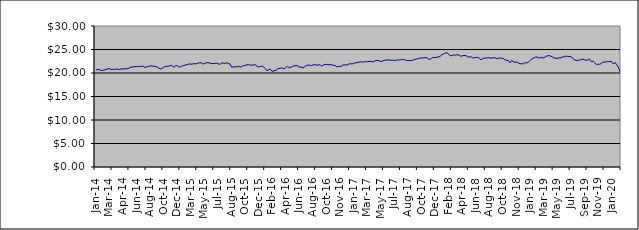
| Category | Series 0 |
|---|---|
| 2014-01-09 | 20.666 |
| 2014-01-17 | 20.724 |
| 2014-01-23 | 20.754 |
| 2014-01-31 | 20.538 |
| 2014-02-10 | 20.55 |
| 2014-02-14 | 20.67 |
| 2014-02-20 | 20.75 |
| 2014-02-28 | 20.867 |
| 2014-03-10 | 20.933 |
| 2014-03-14 | 20.735 |
| 2014-03-20 | 20.783 |
| 2014-03-26 | 20.75 |
| 2014-03-31 | 20.834 |
| 2014-04-09 | 20.834 |
| 2014-04-15 | 20.704 |
| 2014-04-24 | 20.882 |
| 2014-04-30 | 20.864 |
| 2014-05-08 | 20.894 |
| 2014-05-16 | 20.901 |
| 2014-05-22 | 20.916 |
| 2014-05-31 | 21.158 |
| 2014-06-09 | 21.254 |
| 2014-06-16 | 21.292 |
| 2014-06-20 | 21.373 |
| 2014-06-30 | 21.349 |
| 2014-07-09 | 21.404 |
| 2014-07-15 | 21.408 |
| 2014-07-22 | 21.373 |
| 2014-07-31 | 21.481 |
| 2014-08-11 | 21.163 |
| 2014-08-14 | 21.275 |
| 2014-08-21 | 21.422 |
| 2014-08-30 | 21.49 |
| 2014-09-08 | 21.526 |
| 2014-09-16 | 21.416 |
| 2014-09-23 | 21.419 |
| 2014-09-30 | 21.284 |
| 2014-10-09 | 21.092 |
| 2014-10-16 | 20.83 |
| 2014-10-23 | 20.989 |
| 2014-10-31 | 21.237 |
| 2014-11-10 | 21.374 |
| 2014-11-13 | 21.414 |
| 2014-11-20 | 21.463 |
| 2014-11-29 | 21.615 |
| 2014-12-10 | 21.551 |
| 2014-12-18 | 21.2 |
| 2014-12-23 | 21.522 |
| 2014-12-30 | 21.583 |
| 2015-01-08 | 21.22 |
| 2015-01-15 | 21.341 |
| 2015-01-30 | 21.559 |
| 2015-02-10 | 21.572 |
| 2015-02-16 | 21.742 |
| 2015-02-19 | 21.803 |
| 2015-02-28 | 21.937 |
| 2015-03-10 | 21.878 |
| 2015-03-13 | 21.911 |
| 2015-03-19 | 21.994 |
| 2015-03-27 | 21.938 |
| 2015-04-07 | 22.02 |
| 2015-04-16 | 22.192 |
| 2015-04-27 | 22.188 |
| 2015-05-08 | 21.935 |
| 2015-05-14 | 21.998 |
| 2015-05-21 | 22.2 |
| 2015-05-27 | 22.171 |
| 2015-06-03 | 22.151 |
| 2015-06-09 | 21.994 |
| 2015-06-15 | 22.021 |
| 2015-06-22 | 22.006 |
| 2015-06-26 | 22.121 |
| 2015-07-02 | 21.962 |
| 2015-07-09 | 21.831 |
| 2015-07-14 | 22.063 |
| 2015-07-23 | 22.162 |
| 2015-07-29 | 22 |
| 2015-08-06 | 22.186 |
| 2015-08-13 | 22.006 |
| 2015-08-20 | 21.939 |
| 2015-08-27 | 21.245 |
| 2015-09-03 | 21.294 |
| 2015-09-09 | 21.304 |
| 2015-09-15 | 21.325 |
| 2015-09-21 | 21.47 |
| 2015-09-28 | 21.222 |
| 2015-10-07 | 21.404 |
| 2015-10-13 | 21.558 |
| 2015-10-22 | 21.599 |
| 2015-10-28 | 21.742 |
| 2015-11-04 | 21.799 |
| 2015-11-13 | 21.658 |
| 2015-11-19 | 21.665 |
| 2015-11-27 | 21.73 |
| 2015-12-03 | 21.75 |
| 2015-12-10 | 21.462 |
| 2015-12-15 | 21.249 |
| 2015-12-23 | 21.385 |
| 2015-12-29 | 21.477 |
| 2016-01-07 | 21.222 |
| 2016-01-14 | 20.912 |
| 2016-01-21 | 20.454 |
| 2016-01-28 | 20.804 |
| 2016-02-04 | 20.723 |
| 2016-02-11 | 20.312 |
| 2016-02-18 | 20.531 |
| 2016-02-25 | 20.482 |
| 2016-03-03 | 20.907 |
| 2016-03-10 | 20.922 |
| 2016-03-16 | 21.067 |
| 2016-03-29 | 21.016 |
| 2016-04-07 | 20.886 |
| 2016-04-14 | 21.175 |
| 2016-04-28 | 21.406 |
| 2016-05-05 | 21.108 |
| 2016-05-12 | 21.218 |
| 2016-05-19 | 21.383 |
| 2016-05-30 | 21.562 |
| 2016-06-03 | 21.52 |
| 2016-06-09 | 21.596 |
| 2016-06-15 | 21.178 |
| 2016-06-23 | 21.328 |
| 2016-06-29 | 21.059 |
| 2016-07-11 | 21.326 |
| 2016-07-14 | 21.563 |
| 2016-07-21 | 21.675 |
| 2016-07-28 | 21.663 |
| 2016-08-04 | 21.548 |
| 2016-08-11 | 21.725 |
| 2016-08-16 | 21.758 |
| 2016-08-24 | 21.706 |
| 2016-08-30 | 21.669 |
| 2016-09-08 | 21.8 |
| 2016-09-15 | 21.439 |
| 2016-09-22 | 21.686 |
| 2016-09-29 | 21.832 |
| 2016-10-06 | 21.816 |
| 2016-10-13 | 21.734 |
| 2016-10-20 | 21.819 |
| 2016-10-28 | 21.738 |
| 2016-11-03 | 21.632 |
| 2016-11-10 | 21.582 |
| 2016-11-15 | 21.315 |
| 2016-11-23 | 21.396 |
| 2016-11-29 | 21.374 |
| 2016-12-07 | 21.539 |
| 2016-12-14 | 21.763 |
| 2016-12-21 | 21.71 |
| 2016-12-28 | 21.701 |
| 2017-01-05 | 21.895 |
| 2017-01-16 | 21.981 |
| 2017-01-23 | 21.918 |
| 2017-01-30 | 22.061 |
| 2017-02-06 | 22.14 |
| 2017-02-13 | 22.243 |
| 2017-02-20 | 22.313 |
| 2017-02-27 | 22.378 |
| 2017-03-06 | 22.357 |
| 2017-03-13 | 22.281 |
| 2017-03-20 | 22.463 |
| 2017-03-27 | 22.367 |
| 2017-03-30 | 22.472 |
| 2017-04-10 | 22.469 |
| 2017-04-18 | 22.375 |
| 2017-04-24 | 22.479 |
| 2017-04-28 | 22.666 |
| 2017-05-08 | 22.645 |
| 2017-05-15 | 22.624 |
| 2017-05-22 | 22.419 |
| 2017-05-30 | 22.563 |
| 2017-06-06 | 22.664 |
| 2017-06-12 | 22.746 |
| 2017-06-15 | 22.757 |
| 2017-06-20 | 22.756 |
| 2017-06-29 | 22.709 |
| 2017-07-04 | 22.742 |
| 2017-07-10 | 22.637 |
| 2017-07-14 | 22.734 |
| 2017-07-19 | 22.762 |
| 2017-07-24 | 22.795 |
| 2017-07-28 | 22.833 |
| 2017-08-03 | 22.858 |
| 2017-08-09 | 22.839 |
| 2017-08-14 | 22.661 |
| 2017-08-21 | 22.63 |
| 2017-08-24 | 22.655 |
| 2017-08-30 | 22.659 |
| 2017-09-07 | 22.724 |
| 2017-09-14 | 22.906 |
| 2017-09-20 | 22.994 |
| 2017-09-29 | 23.048 |
| 2017-10-05 | 23.176 |
| 2017-10-11 | 23.201 |
| 2017-10-16 | 23.212 |
| 2017-10-23 | 23.262 |
| 2017-10-30 | 23.251 |
| 2017-11-07 | 22.993 |
| 2017-11-15 | 22.86 |
| 2017-11-23 | 23.223 |
| 2017-11-29 | 23.282 |
| 2017-12-07 | 23.273 |
| 2017-12-13 | 23.357 |
| 2017-12-18 | 23.417 |
| 2017-12-28 | 23.583 |
| 2018-01-08 | 23.882 |
| 2018-01-17 | 24.082 |
| 2018-01-24 | 24.257 |
| 2018-01-30 | 24.271 |
| 2018-02-05 | 24.022 |
| 2018-02-13 | 23.612 |
| 2018-02-19 | 23.775 |
| 2018-02-27 | 23.86 |
| 2018-03-07 | 23.778 |
| 2018-03-14 | 23.922 |
| 2018-03-21 | 23.82 |
| 2018-03-29 | 23.571 |
| 2018-04-10 | 23.654 |
| 2018-04-16 | 23.737 |
| 2018-04-23 | 23.713 |
| 2018-04-27 | 23.478 |
| 2018-05-10 | 23.379 |
| 2018-05-15 | 23.476 |
| 2018-05-22 | 23.257 |
| 2018-05-30 | 23.217 |
| 2018-06-06 | 23.29 |
| 2018-06-13 | 23.342 |
| 2018-06-20 | 23.13 |
| 2018-06-29 | 22.795 |
| 2018-07-10 | 23.074 |
| 2018-07-16 | 23.195 |
| 2018-07-23 | 23.15 |
| 2018-07-30 | 23.252 |
| 2018-08-07 | 23.263 |
| 2018-08-13 | 23.134 |
| 2018-08-24 | 23.22 |
| 2018-08-30 | 23.285 |
| 2018-09-06 | 23.118 |
| 2018-09-13 | 23.004 |
| 2018-09-24 | 23.249 |
| 2018-09-28 | 23.124 |
| 2018-10-04 | 23.105 |
| 2018-10-10 | 22.844 |
| 2018-10-16 | 22.695 |
| 2018-10-23 | 22.685 |
| 2018-10-30 | 22.177 |
| 2018-11-07 | 22.641 |
| 2018-11-15 | 22.418 |
| 2018-11-21 | 22.291 |
| 2018-11-29 | 22.324 |
| 2018-12-07 | 22.174 |
| 2018-12-14 | 21.937 |
| 2018-12-21 | 21.995 |
| 2018-12-28 | 21.921 |
| 2019-01-08 | 22.216 |
| 2019-01-14 | 22.137 |
| 2019-01-21 | 22.343 |
| 2019-01-30 | 22.677 |
| 2019-02-11 | 22.991 |
| 2019-02-14 | 23.148 |
| 2019-02-21 | 23.363 |
| 2019-02-27 | 23.417 |
| 2019-03-07 | 23.219 |
| 2019-03-14 | 23.215 |
| 2019-03-21 | 23.355 |
| 2019-03-29 | 23.144 |
| 2019-04-04 | 23.52 |
| 2019-04-12 | 23.623 |
| 2019-04-18 | 23.722 |
| 2019-04-29 | 23.593 |
| 2019-05-08 | 23.456 |
| 2019-05-15 | 23.177 |
| 2019-05-23 | 23.173 |
| 2019-05-30 | 23.075 |
| 2019-06-10 | 23.23 |
| 2019-06-14 | 23.2 |
| 2019-06-21 | 23.421 |
| 2019-06-28 | 23.429 |
| 2019-07-04 | 23.606 |
| 2019-07-15 | 23.519 |
| 2019-07-22 | 23.512 |
| 2019-07-30 | 23.471 |
| 2019-08-06 | 23.206 |
| 2019-08-16 | 22.785 |
| 2019-08-22 | 22.717 |
| 2019-08-30 | 22.616 |
| 2019-09-09 | 22.825 |
| 2019-09-16 | 22.807 |
| 2019-09-20 | 22.982 |
| 2019-09-27 | 22.808 |
| 2019-10-03 | 22.725 |
| 2019-10-09 | 22.773 |
| 2019-10-15 | 22.938 |
| 2019-10-30 | 22.399 |
| 2019-11-07 | 22.548 |
| 2019-11-14 | 22.215 |
| 2019-11-21 | 21.756 |
| 2019-11-29 | 21.912 |
| 2019-12-05 | 21.832 |
| 2019-12-11 | 22.065 |
| 2019-12-17 | 22.342 |
| 2019-12-23 | 22.325 |
| 2019-12-30 | 22.41 |
| 2020-01-07 | 22.401 |
| 2020-01-15 | 22.468 |
| 2020-01-22 | 22.384 |
| 2020-01-30 | 21.899 |
| 2020-02-06 | 22.266 |
| 2020-02-14 | 21.742 |
| 2020-02-20 | 21.186 |
| 2020-02-28 | 20.217 |